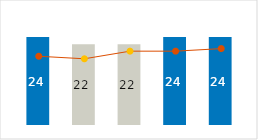
| Category | Fixed Cost |
|---|---|
| 0 | 24 |
| 1 | 22 |
| 2 | 22 |
| 3 | 24 |
| 4 | 24 |